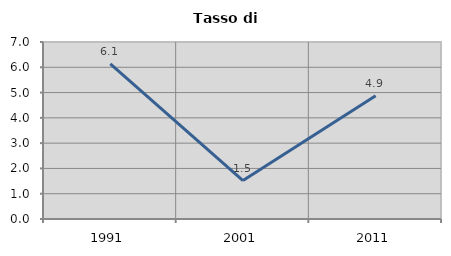
| Category | Tasso di disoccupazione   |
|---|---|
| 1991.0 | 6.137 |
| 2001.0 | 1.521 |
| 2011.0 | 4.878 |